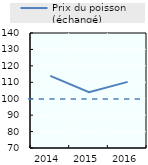
| Category | Prix du poisson (échangé) |
|---|---|
| 2014.0 | 113.856 |
| 2015.0 | 103.956 |
| 2016.0 | 110.257 |